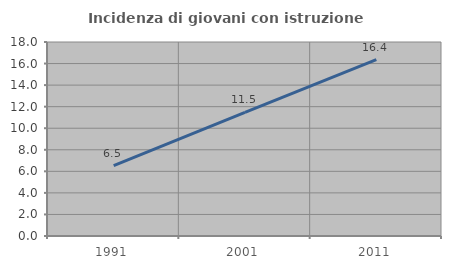
| Category | Incidenza di giovani con istruzione universitaria |
|---|---|
| 1991.0 | 6.522 |
| 2001.0 | 11.475 |
| 2011.0 | 16.364 |